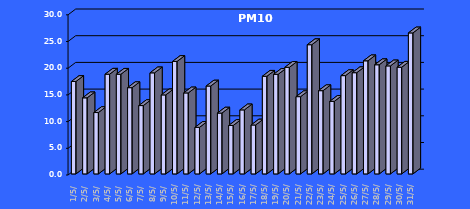
| Category | PM10 [µg/m3] |
|---|---|
| 2023-05-01 | 17.308 |
| 2023-05-02 | 14.251 |
| 2023-05-03 | 11.493 |
| 2023-05-04 | 18.674 |
| 2023-05-05 | 18.663 |
| 2023-05-06 | 16.153 |
| 2023-05-07 | 12.797 |
| 2023-05-08 | 18.928 |
| 2023-05-09 | 14.798 |
| 2023-05-10 | 21.059 |
| 2023-05-11 | 15.167 |
| 2023-05-12 | 8.716 |
| 2023-05-13 | 16.458 |
| 2023-05-14 | 11.393 |
| 2023-05-15 | 9.071 |
| 2023-05-16 | 11.992 |
| 2023-05-17 | 9.162 |
| 2023-05-18 | 18.287 |
| 2023-05-19 | 18.647 |
| 2023-05-20 | 19.962 |
| 2023-05-21 | 14.468 |
| 2023-05-22 | 24.197 |
| 2023-05-23 | 15.59 |
| 2023-05-24 | 13.589 |
| 2023-05-25 | 18.409 |
| 2023-05-26 | 18.955 |
| 2023-05-27 | 21.181 |
| 2023-05-28 | 20.443 |
| 2023-05-29 | 20.232 |
| 2023-05-30 | 19.98 |
| 2023-05-31 | 26.406 |